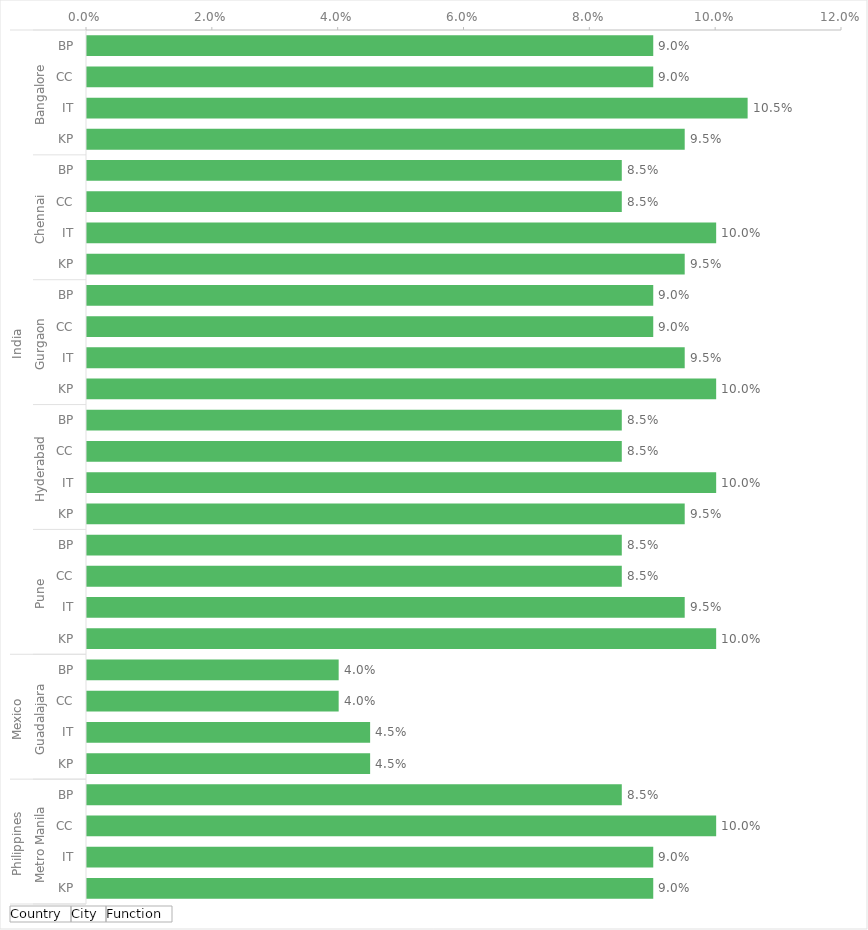
| Category | Total |
|---|---|
| 0 | 0.09 |
| 1 | 0.09 |
| 2 | 0.105 |
| 3 | 0.095 |
| 4 | 0.085 |
| 5 | 0.085 |
| 6 | 0.1 |
| 7 | 0.095 |
| 8 | 0.09 |
| 9 | 0.09 |
| 10 | 0.095 |
| 11 | 0.1 |
| 12 | 0.085 |
| 13 | 0.085 |
| 14 | 0.1 |
| 15 | 0.095 |
| 16 | 0.085 |
| 17 | 0.085 |
| 18 | 0.095 |
| 19 | 0.1 |
| 20 | 0.04 |
| 21 | 0.04 |
| 22 | 0.045 |
| 23 | 0.045 |
| 24 | 0.085 |
| 25 | 0.1 |
| 26 | 0.09 |
| 27 | 0.09 |